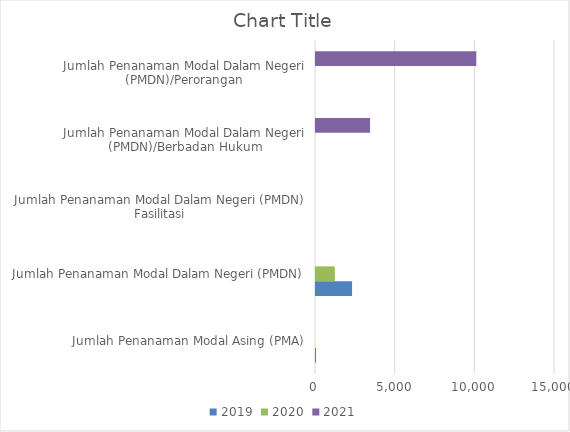
| Category | 2019 | Series 1 | 2020 | 2021 |
|---|---|---|---|---|
| Jumlah Penanaman Modal Asing (PMA) | 2 |  | 0 | 0 |
| Jumlah Penanaman Modal Dalam Negeri (PMDN) | 2263 |  | 1181 | 0 |
| Jumlah Penanaman Modal Dalam Negeri (PMDN) Fasilitasi | 0 |  | 0 | 0 |
| Jumlah Penanaman Modal Dalam Negeri (PMDN)/Berbadan Hukum | 0 |  | 0 | 3393 |
| Jumlah Penanaman Modal Dalam Negeri (PMDN)/Perorangan | 0 |  | 0 | 10061 |